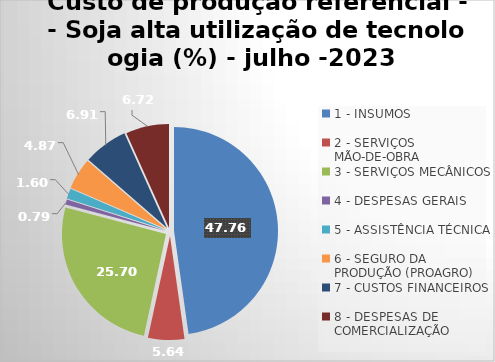
| Category | Series 0 |
|---|---|
| 1 - INSUMOS | 47.763 |
| 2 - SERVIÇOS MÃO-DE-OBRA | 5.644 |
| 3 - SERVIÇOS MECÂNICOS | 25.703 |
| 4 - DESPESAS GERAIS  | 0.791 |
| 5 - ASSISTÊNCIA TÉCNICA | 1.598 |
| 6 - SEGURO DA PRODUÇÃO (PROAGRO) | 4.874 |
| 7 - CUSTOS FINANCEIROS | 6.91 |
| 8 - DESPESAS DE COMERCIALIZAÇÃO | 6.718 |